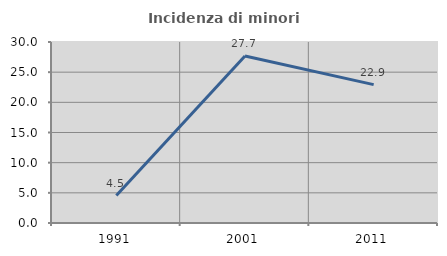
| Category | Incidenza di minori stranieri |
|---|---|
| 1991.0 | 4.545 |
| 2001.0 | 27.67 |
| 2011.0 | 22.93 |